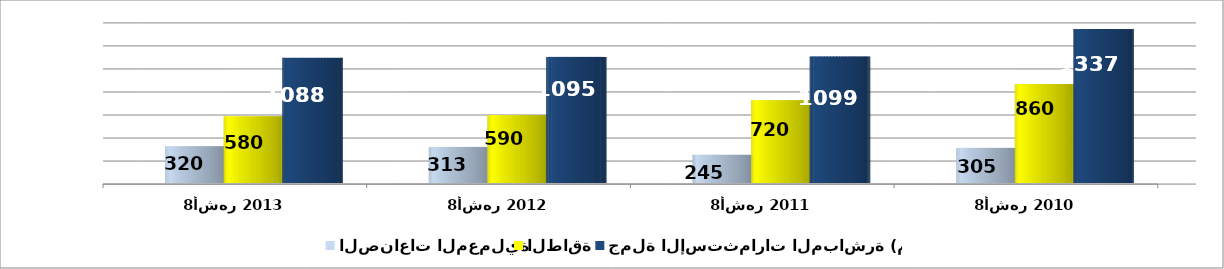
| Category | الصناعات المعملية | الطاقة | جملة الإستثمارات المباشرة (م,د) |
|---|---|---|---|
| 8أشهر 2010 | 305.1 | 860 | 1337.3 |
| 8أشهر 2011 | 245.2 | 720 | 1099.4 |
| 8أشهر 2012 | 313.4 | 590 | 1095.4 |
| 8أشهر 2013 | 320 | 580 | 1087.5 |